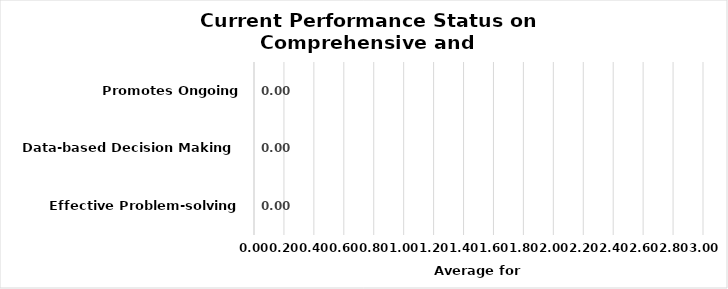
| Category | Current Performance Status on
Comprehensive and Functional Assessment System |
|---|---|
| Effective Problem-solving Process | 0 |
| Data-based Decision Making | 0 |
| Promotes Ongoing Improvement | 0 |